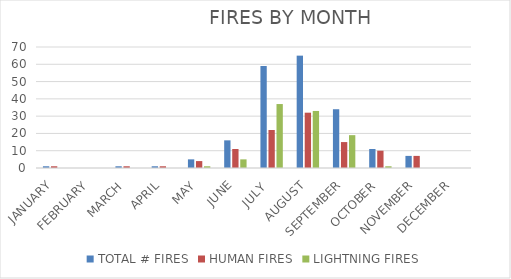
| Category | TOTAL # FIRES | HUMAN FIRES | LIGHTNING FIRES |
|---|---|---|---|
| JANUARY | 1 | 1 | 0 |
| FEBRUARY | 0 | 0 | 0 |
| MARCH | 1 | 1 | 0 |
| APRIL | 1 | 1 | 0 |
| MAY | 5 | 4 | 1 |
| JUNE | 16 | 11 | 5 |
| JULY  | 59 | 22 | 37 |
| AUGUST | 65 | 32 | 33 |
| SEPTEMBER | 34 | 15 | 19 |
| OCTOBER | 11 | 10 | 1 |
| NOVEMBER | 7 | 7 | 0 |
| DECEMBER | 0 | 0 | 0 |